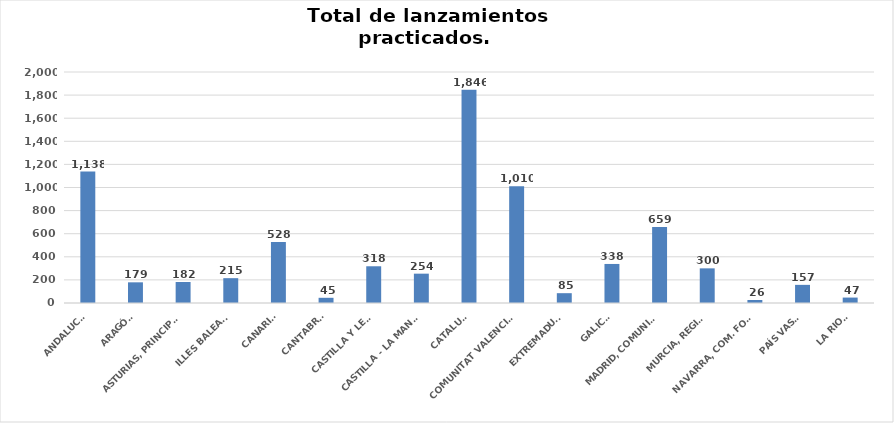
| Category | Series 0 |
|---|---|
| ANDALUCÍA | 1138 |
| ARAGÓN | 179 |
| ASTURIAS, PRINCIPADO | 182 |
| ILLES BALEARS | 215 |
| CANARIAS | 528 |
| CANTABRIA | 45 |
| CASTILLA Y LEÓN | 318 |
| CASTILLA - LA MANCHA | 254 |
| CATALUÑA | 1846 |
| COMUNITAT VALENCIANA | 1010 |
| EXTREMADURA | 85 |
| GALICIA | 338 |
| MADRID, COMUNIDAD | 659 |
| MURCIA, REGIÓN | 300 |
| NAVARRA, COM. FORAL | 26 |
| PAÍS VASCO | 157 |
| LA RIOJA | 47 |